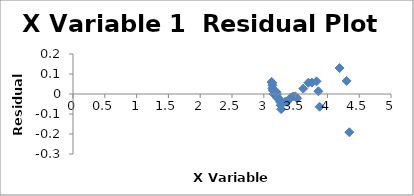
| Category | Series 0 |
|---|---|
| 4.34551095769695 | -0.191 |
| 4.301919388035856 | 0.065 |
| 4.1917862475822 | 0.13 |
| 3.877774349991398 | -0.064 |
| 3.858416877723488 | 0.014 |
| 3.82936810798882 | 0.063 |
| 3.7571681922142726 | 0.057 |
| 3.699143687394484 | 0.056 |
| 3.619927710291468 | 0.027 |
| 3.5268559871258747 | -0.022 |
| 3.4956830676169153 | -0.012 |
| 3.4583356259919475 | -0.012 |
| 3.416141031168329 | -0.02 |
| 3.3656751404559175 | -0.039 |
| 3.3370597263205246 | -0.038 |
| 3.2723058444020863 | -0.076 |
| 3.2655253352190736 | -0.056 |
| 3.256958152560932 | -0.04 |
| 3.24551266781415 | -0.028 |
| 3.231214647962601 | -0.021 |
| 3.210853365314893 | -0.02 |
| 3.2068258760318495 | -0.004 |
| 3.2008504980910772 | 0.009 |
| 3.1743505974793798 | 0.001 |
| 3.1559430179718366 | 0 |
| 3.153204900084284 | 0.014 |
| 3.1420764610732848 | 0.019 |
| 3.1357685145678222 | 0.029 |
| 3.1351326513767748 | 0.043 |
| 3.132579847659737 | 0.055 |
| 3.1231980750319988 | 0.06 |